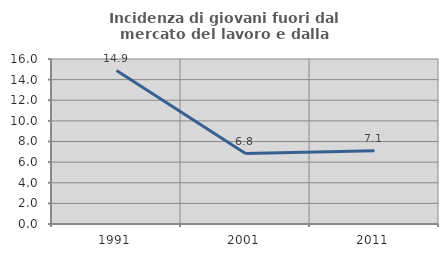
| Category | Incidenza di giovani fuori dal mercato del lavoro e dalla formazione  |
|---|---|
| 1991.0 | 14.876 |
| 2001.0 | 6.829 |
| 2011.0 | 7.104 |